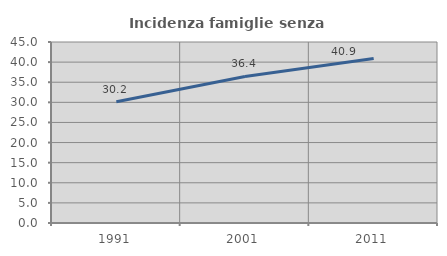
| Category | Incidenza famiglie senza nuclei |
|---|---|
| 1991.0 | 30.156 |
| 2001.0 | 36.435 |
| 2011.0 | 40.923 |